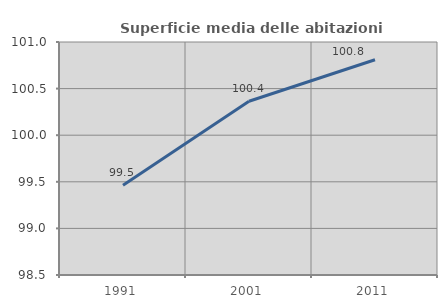
| Category | Superficie media delle abitazioni occupate |
|---|---|
| 1991.0 | 99.464 |
| 2001.0 | 100.364 |
| 2011.0 | 100.81 |